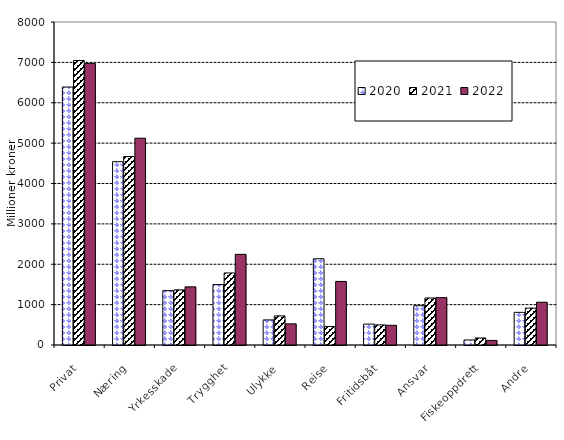
| Category | 2020 | 2021 | 2022 |
|---|---|---|---|
| Privat | 6389.024 | 7045.66 | 6974.812 |
| Næring | 4539.877 | 4668.555 | 5121.547 |
| Yrkesskade | 1346.565 | 1366.204 | 1440.024 |
| Trygghet | 1496.949 | 1784.325 | 2245.774 |
| Ulykke | 621.675 | 720.864 | 523.632 |
| Reise | 2135.98 | 459.278 | 1574.599 |
| Fritidsbåt | 517.485 | 498.321 | 488.151 |
| Ansvar | 973.351 | 1164.283 | 1173.572 |
| Fiskeoppdrett | 124.359 | 173.799 | 113.031 |
| Andre | 808.908 | 914.046 | 1059.447 |